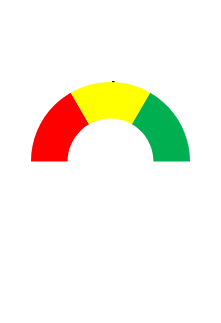
| Category | Series 1 |
|---|---|
| 0 | 34.206 |
| 1 | 1 |
| 2 | 100 |